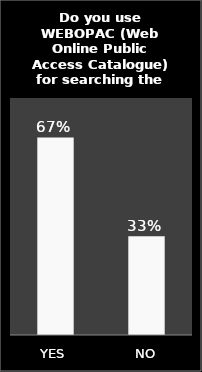
| Category | Series 0 |
|---|---|
| YES | 0.667 |
| NO | 0.333 |